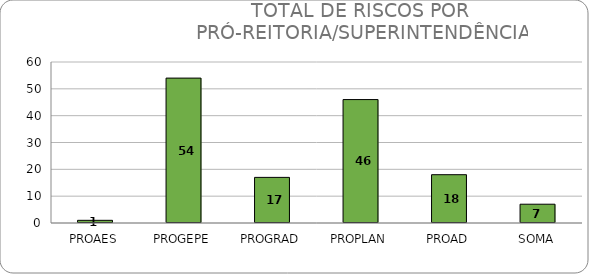
| Category | Qtd de Riscos |
|---|---|
| PROAES | 1 |
| PROGEPE | 54 |
| PROGRAD | 17 |
| PROPLAN | 46 |
| PROAD | 18 |
| SOMA | 7 |